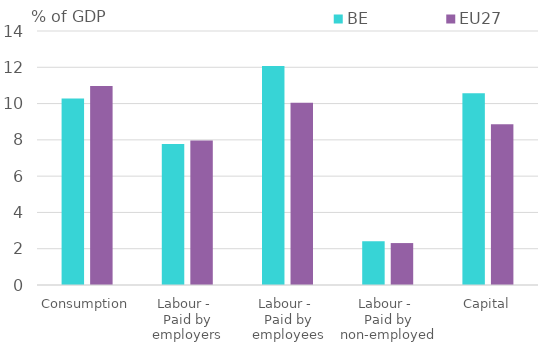
| Category | BE | EU27 |
|---|---|---|
| Consumption | 10.276 | 10.967 |
| Labour - 
Paid by employers | 7.769 | 7.966 |
| Labour - 
Paid by employees | 12.075 | 10.052 |
| Labour - 
Paid by non-employed | 2.407 | 2.311 |
| Capital | 10.569 | 8.858 |